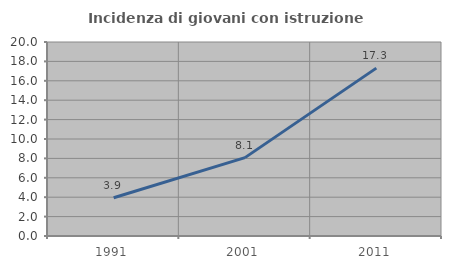
| Category | Incidenza di giovani con istruzione universitaria |
|---|---|
| 1991.0 | 3.947 |
| 2001.0 | 8.081 |
| 2011.0 | 17.308 |